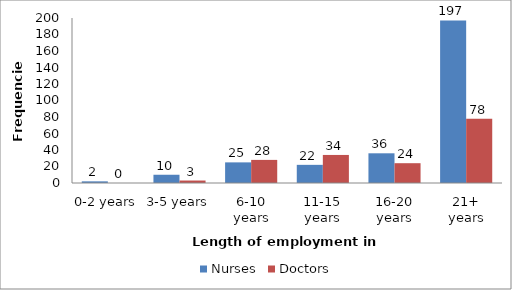
| Category | Nurses | Doctors |
|---|---|---|
| 0-2 years | 2 | 0 |
| 3-5 years | 10 | 3 |
| 6-10 years | 25 | 28 |
| 11-15 years | 22 | 34 |
| 16-20 years | 36 | 24 |
| 21+ years | 197 | 78 |